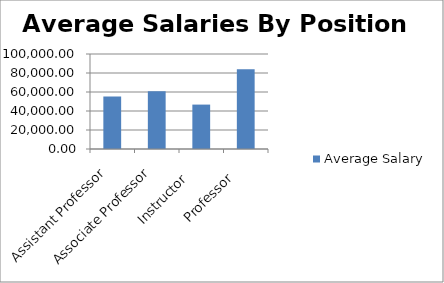
| Category | Average Salary |
|---|---|
| Assistant Professor   | 55297.125 |
| Associate Professor   | 60693.182 |
| Instructor    | 46749.059 |
| Professor    | 84059.867 |